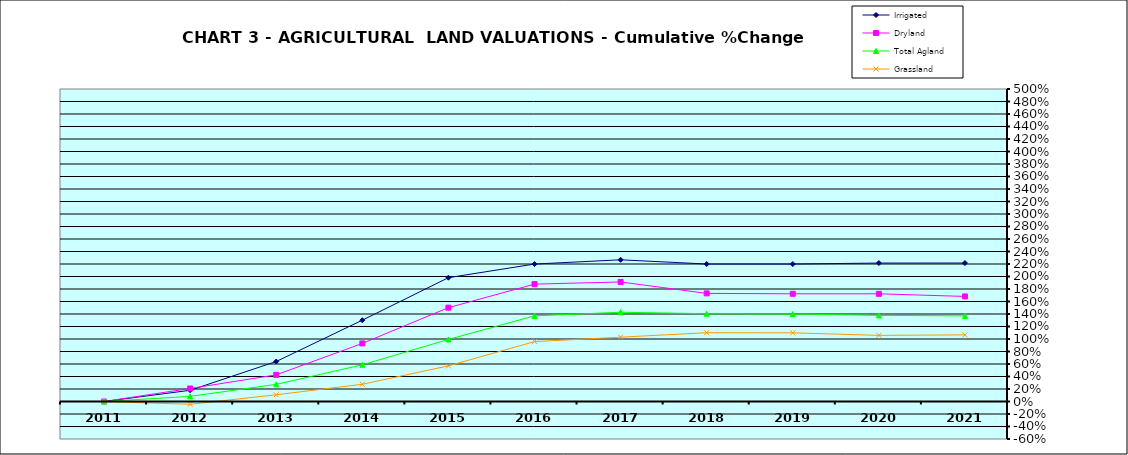
| Category | Irrigated | Dryland | Total Agland | Grassland |
|---|---|---|---|---|
| 2011.0 | 0 | 0 | 0 | 0 |
| 2012.0 | 0.179 | 0.208 | 0.082 | -0.045 |
| 2013.0 | 0.64 | 0.426 | 0.274 | 0.108 |
| 2014.0 | 1.301 | 0.929 | 0.587 | 0.275 |
| 2015.0 | 1.981 | 1.502 | 0.993 | 0.57 |
| 2016.0 | 2.199 | 1.878 | 1.371 | 0.958 |
| 2017.0 | 2.267 | 1.913 | 1.428 | 1.029 |
| 2018.0 | 2.2 | 1.73 | 1.404 | 1.1 |
| 2019.0 | 2.2 | 1.723 | 1.4 | 1.099 |
| 2020.0 | 2.215 | 1.723 | 1.378 | 1.058 |
| 2021.0 | 2.215 | 1.681 | 1.37 | 1.066 |